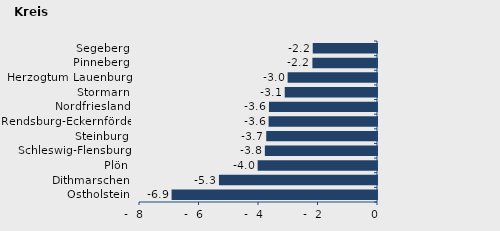
| Category | Überschuss der Geborenen (+) bzw. Gestorbenen (-) |
|---|---|
| Ostholstein | -6.905 |
| Dithmarschen | -5.313 |
| Plön | -4.013 |
| Schleswig-Flensburg | -3.769 |
| Steinburg | -3.723 |
| Rendsburg-Eckernförde | -3.644 |
| Nordfriesland | -3.632 |
| Stormarn | -3.101 |
| Herzogtum Lauenburg | -3.004 |
| Pinneberg | -2.172 |
| Segeberg | -2.16 |